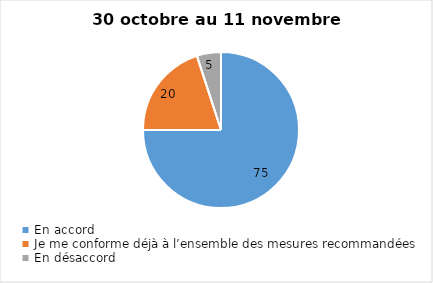
| Category | Series 0 |
|---|---|
| En accord | 75 |
| Je me conforme déjà à l’ensemble des mesures recommandées | 20 |
| En désaccord | 5 |